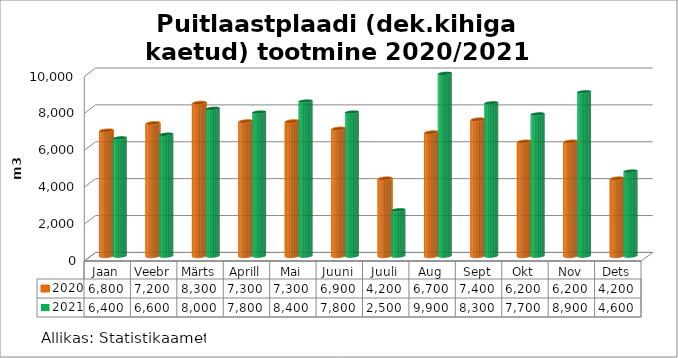
| Category | 2020 | 2021 |
|---|---|---|
| Jaan | 6800 | 6400 |
| Veebr | 7200 | 6600 |
| Märts | 8300 | 8000 |
| Aprill | 7300 | 7800 |
| Mai | 7300 | 8400 |
| Juuni | 6900 | 7800 |
| Juuli | 4200 | 2500 |
| Aug | 6700 | 9900 |
| Sept | 7400 | 8300 |
| Okt | 6200 | 7700 |
| Nov | 6200 | 8900 |
| Dets | 4200 | 4600 |